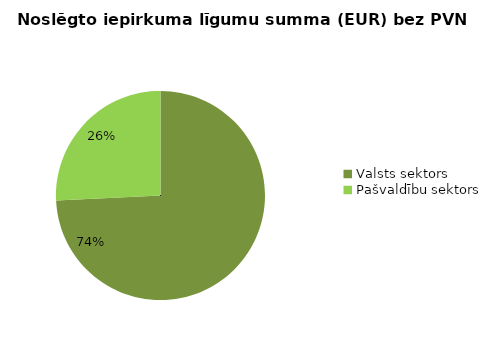
| Category | Noslēgto iepirkuma līgumu summa (EUR) bez PVN |
|---|---|
| Valsts sektors | 13835218 |
| Pašvaldību sektors | 4796805 |